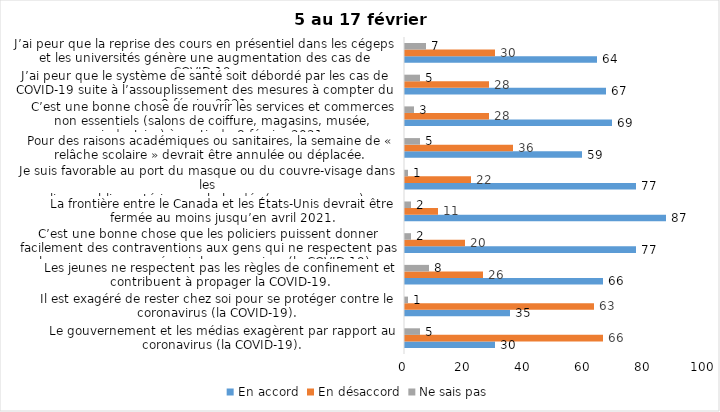
| Category | En accord | En désaccord | Ne sais pas |
|---|---|---|---|
| Le gouvernement et les médias exagèrent par rapport au coronavirus (la COVID-19). | 30 | 66 | 5 |
| Il est exagéré de rester chez soi pour se protéger contre le coronavirus (la COVID-19). | 35 | 63 | 1 |
| Les jeunes ne respectent pas les règles de confinement et contribuent à propager la COVID-19. | 66 | 26 | 8 |
| C’est une bonne chose que les policiers puissent donner facilement des contraventions aux gens qui ne respectent pas les mesures pour prévenir le coronavirus (la COVID-19). | 77 | 20 | 2 |
| La frontière entre le Canada et les États-Unis devrait être fermée au moins jusqu’en avril 2021. | 87 | 11 | 2 |
| Je suis favorable au port du masque ou du couvre-visage dans les
lieux publics extérieurs achalandés (ex. rues, parcs) | 77 | 22 | 1 |
| Pour des raisons académiques ou sanitaires, la semaine de « relâche scolaire » devrait être annulée ou déplacée. | 59 | 36 | 5 |
| C’est une bonne chose de rouvrir les services et commerces non essentiels (salons de coiffure, magasins, musée, industries) à partir du 8 février 2021. | 69 | 28 | 3 |
| J’ai peur que le système de santé soit débordé par les cas de COVID-19 suite à l’assouplissement des mesures à compter du 8 février 2021. | 67 | 28 | 5 |
| J’ai peur que la reprise des cours en présentiel dans les cégeps et les universités génère une augmentation des cas de COVID-19. | 64 | 30 | 7 |